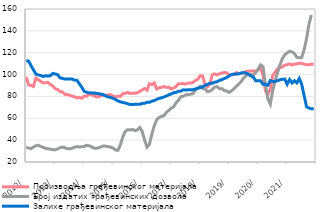
| Category | Производња грађевинског материјала |
|---|---|
| 2012-01-01 | 97.766 |
| 2012-02-01 | 90.572 |
| 2012-03-01 | 90.08 |
| 2012-04-01 | 89.077 |
| 2012-05-01 | 96.829 |
| 2012-06-01 | 95.266 |
| 2012-07-01 | 93.752 |
| 2012-08-01 | 92.34 |
| 2012-09-01 | 92.655 |
| 2012-10-01 | 92.78 |
| 2012-11-01 | 90.967 |
| 2012-12-01 | 89.549 |
| 2013-01-01 | 87.007 |
| 2013-02-01 | 86.387 |
| 2013-03-01 | 84.281 |
| 2013-04-01 | 84.17 |
| 2013-05-01 | 81.94 |
| 2013-06-01 | 81.641 |
| 2013-07-01 | 81.118 |
| 2013-08-01 | 80.31 |
| 2013-09-01 | 79.733 |
| 2013-10-01 | 78.665 |
| 2013-11-01 | 79.208 |
| 2013-12-01 | 78.296 |
| 2014-01-01 | 80.272 |
| 2014-02-01 | 80.2 |
| 2014-03-01 | 81.927 |
| 2014-04-01 | 81.432 |
| 2014-05-01 | 80.598 |
| 2014-06-01 | 79.587 |
| 2014-07-01 | 79.741 |
| 2014-08-01 | 80.695 |
| 2014-09-01 | 81.076 |
| 2014-10-01 | 81.1 |
| 2014-11-01 | 81.552 |
| 2014-12-01 | 81.481 |
| 2015-01-01 | 80.406 |
| 2015-02-01 | 79.651 |
| 2015-03-01 | 80.22 |
| 2015-04-01 | 80.065 |
| 2015-05-01 | 82.586 |
| 2015-06-01 | 82.792 |
| 2015-07-01 | 83.729 |
| 2015-08-01 | 82.761 |
| 2015-09-01 | 83.003 |
| 2015-10-01 | 82.918 |
| 2015-11-01 | 83.263 |
| 2015-12-01 | 84.623 |
| 2016-01-01 | 86.083 |
| 2016-02-01 | 87.219 |
| 2016-03-01 | 85.705 |
| 2016-04-01 | 91.724 |
| 2016-05-01 | 90.811 |
| 2016-06-01 | 92.331 |
| 2016-07-01 | 86.816 |
| 2016-08-01 | 87.989 |
| 2016-09-01 | 88.303 |
| 2016-10-01 | 88.971 |
| 2016-11-01 | 88.24 |
| 2016-12-01 | 88.45 |
| 2017-01-01 | 86.887 |
| 2017-02-01 | 87.69 |
| 2017-03-01 | 89.145 |
| 2017-04-01 | 91.657 |
| 2017-05-01 | 91.618 |
| 2017-06-01 | 91.765 |
| 2017-07-01 | 91.229 |
| 2017-08-01 | 92.344 |
| 2017-09-01 | 92.099 |
| 2017-10-01 | 92.861 |
| 2017-11-01 | 94.518 |
| 2017-12-01 | 95.728 |
| 2018-01-01 | 99.065 |
| 2018-02-01 | 98.597 |
| 2018-03-01 | 90.538 |
| 2018-04-01 | 88.777 |
| 2018-05-01 | 91.01 |
| 2018-06-01 | 99.855 |
| 2018-07-01 | 100.634 |
| 2018-08-01 | 99.797 |
| 2018-09-01 | 100.733 |
| 2018-10-31 | 101.462 |
| 2018-11-30 | 101.869 |
| 2018-12-31 | 101.525 |
| 2019-01-31 | 99.347 |
| 2019-02-28 | 99.899 |
| 2019-03-31 | 99.866 |
| 2019-04-30 | 101.771 |
| 2019-05-31 | 100.907 |
| 2019-06-30 | 101.154 |
| 2019-07-31 | 101.72 |
| 2019-08-31 | 103.031 |
| 2019-09-30 | 103.008 |
| 2019-10-31 | 103.447 |
| 2019-11-30 | 103.206 |
| 2019-12-31 | 103.244 |
| 2020-01-31 | 104.717 |
| 2020-02-29 | 105.32 |
| 2020-03-31 | 99.539 |
| 2020-04-30 | 84.917 |
| 2020-05-31 | 81.886 |
| 2020-06-30 | 86.605 |
| 2020-07-31 | 99.146 |
| 2020-08-31 | 102.151 |
| 2020-09-30 | 105.248 |
| 2020-10-31 | 106.286 |
| 2020-11-30 | 107.099 |
| 2020-12-31 | 108.607 |
| 2021-01-31 | 109.095 |
| 2021-02-28 | 109.739 |
| 2021-03-31 | 108.759 |
| 2021-04-30 | 109.605 |
| 2021-05-31 | 109.669 |
| 2021-06-30 | 110.402 |
| 2021-07-31 | 110.168 |
| 2021-08-31 | 109.585 |
| 2021-09-30 | 108.935 |
| 2021-10-31 | 109.013 |
| 2021-11-30 | 109.604 |
| 2021-12-31 | 109.426 |